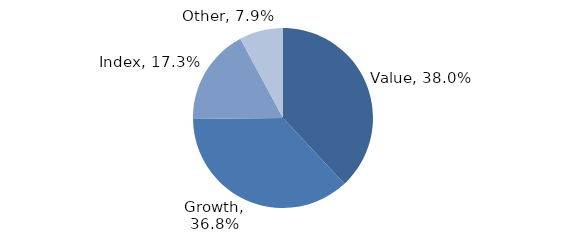
| Category | Investment Style |
|---|---|
| Value | 0.38 |
| Growth | 0.368 |
| Index | 0.173 |
| Other | 0.079 |